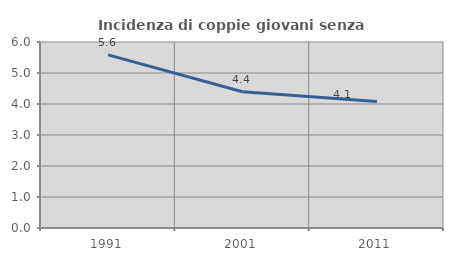
| Category | Incidenza di coppie giovani senza figli |
|---|---|
| 1991.0 | 5.586 |
| 2001.0 | 4.393 |
| 2011.0 | 4.083 |